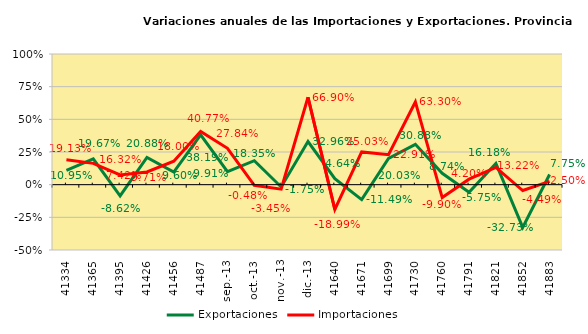
| Category | Exportaciones | Importaciones |
|---|---|---|
| mar-13 | 0.109 | 0.191 |
| abr-13 | 0.197 | 0.163 |
| may-13 | -0.086 | 0.074 |
| jun-13 | 0.209 | 0.097 |
| jul-13 | 0.096 | 0.18 |
| ago-13 | 0.382 | 0.408 |
| sep.-13 | 0.099 | 0.278 |
| oct.-13 | 0.183 | -0.005 |
| nov.-13 | -0.017 | -0.035 |
| dic.-13 | 0.33 | 0.669 |
| ene-14 | 0.046 | -0.19 |
| feb-14 | -0.115 | 0.25 |
| mar-14 | 0.2 | 0.229 |
| abr-14 | 0.309 | 0.633 |
| may-14 | 0.087 | -0.099 |
| jun-14 | -0.058 | 0.042 |
| jul-14 | 0.162 | 0.132 |
| ago-14 | -0.327 | -0.045 |
| sep-14 | 0.078 | 0.025 |